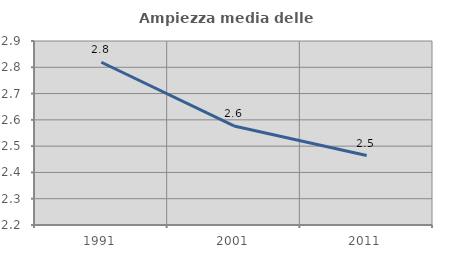
| Category | Ampiezza media delle famiglie |
|---|---|
| 1991.0 | 2.819 |
| 2001.0 | 2.577 |
| 2011.0 | 2.464 |